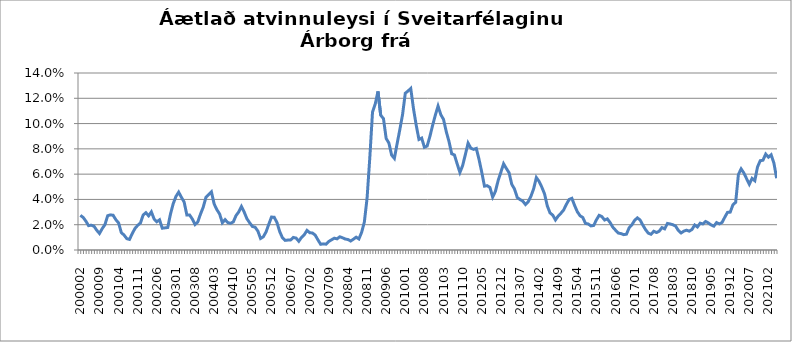
| Category | Series 0 |
|---|---|
| 200002 | 0.027 |
| 200003 | 0.026 |
| 200004 | 0.023 |
| 200005 | 0.019 |
| 200006 | 0.02 |
| 200007 | 0.019 |
| 200008 | 0.016 |
| 200009 | 0.013 |
| 200010 | 0.017 |
| 200011 | 0.02 |
| 200012 | 0.027 |
| 200101 | 0.028 |
| 200102 | 0.027 |
| 200103 | 0.024 |
| 200104 | 0.021 |
| 200105 | 0.014 |
| 200106 | 0.012 |
| 200107 | 0.009 |
| 200108 | 0.008 |
| 200109 | 0.013 |
| 200110 | 0.017 |
| 200111 | 0.02 |
| 200112 | 0.021 |
| 200201 | 0.028 |
| 200202 | 0.03 |
| 200203 | 0.027 |
| 200204 | 0.03 |
| 200205 | 0.025 |
| 200206 | 0.022 |
| 200207 | 0.024 |
| 200208 | 0.017 |
| 200209 | 0.018 |
| 200210 | 0.018 |
| 200211 | 0.028 |
| 200212 | 0.037 |
| 200301 | 0.042 |
| 200302 | 0.046 |
| 200303 | 0.042 |
| 200304 | 0.038 |
| 200305 | 0.028 |
| 200306 | 0.028 |
| 200307 | 0.025 |
| 200308 | 0.02 |
| 200309 | 0.022 |
| 200310 | 0.028 |
| 200311 | 0.034 |
| 200312 | 0.042 |
| 200401 | 0.044 |
| 200402 | 0.046 |
| 200403 | 0.036 |
| 200404 | 0.032 |
| 200405 | 0.029 |
| 200406 | 0.022 |
| 200407 | 0.024 |
| 200408 | 0.022 |
| 200409 | 0.021 |
| 200410 | 0.022 |
| 200411 | 0.027 |
| 200412 | 0.03 |
| 200501 | 0.034 |
| 200502 | 0.03 |
| 200503 | 0.025 |
| 200504 | 0.022 |
| 200505 | 0.019 |
| 200506 | 0.018 |
| 200507 | 0.015 |
| 200508 | 0.009 |
| 200509 | 0.01 |
| 200510 | 0.014 |
| 200511 | 0.02 |
| 200512 | 0.026 |
| 200601 | 0.026 |
| 200602 | 0.022 |
| 200603 | 0.015 |
| 200604 | 0.01 |
| 200605 | 0.008 |
| 200606 | 0.008 |
| 200607 | 0.008 |
| 200608 | 0.01 |
| 200609 | 0.009 |
| 200610 | 0.007 |
| 200611 | 0.01 |
| 200612 | 0.012 |
| 200701 | 0.015 |
| 200702 | 0.014 |
| 200703 | 0.013 |
| 200704 | 0.012 |
| 200705 | 0.008 |
| 200706 | 0.005 |
| 200707 | 0.005 |
| 200708 | 0.005 |
| 200709 | 0.007 |
| 200710 | 0.008 |
| 200711 | 0.009 |
| 200712 | 0.009 |
| 200801 | 0.01 |
| 200802 | 0.01 |
| 200803 | 0.009 |
| 200804 | 0.008 |
| 200805 | 0.007 |
| 200806 | 0.009 |
| 200807 | 0.01 |
| 200808 | 0.009 |
| 200809 | 0.014 |
| 200810 | 0.022 |
| 200811 | 0.041 |
| 200812 | 0.073 |
| 200901 | 0.109 |
| 200902 | 0.116 |
| 200903 | 0.125 |
| 200904 | 0.107 |
| 200905 | 0.104 |
| 200906 | 0.088 |
| 200907 | 0.085 |
| 200908 | 0.075 |
| 200909 | 0.072 |
| 200910 | 0.084 |
| 200911 | 0.095 |
| 200912 | 0.107 |
| 201001 | 0.124 |
| 201002 | 0.126 |
| 201003 | 0.128 |
| 201004 | 0.112 |
| 201005 | 0.099 |
| 201006 | 0.087 |
| 201007 | 0.089 |
| 201008 | 0.081 |
| 201009 | 0.082 |
| 201010 | 0.09 |
| 201011 | 0.099 |
| 201012 | 0.107 |
| 201101 | 0.114 |
| 201102 | 0.107 |
| 201103 | 0.103 |
| 201104 | 0.094 |
| 201105 | 0.086 |
| 201106 | 0.076 |
| 201107 | 0.075 |
| 201108 | 0.068 |
| 201109 | 0.061 |
| 201110 | 0.067 |
| 201111 | 0.076 |
| 201112 | 0.085 |
| 201201 | 0.081 |
| 201202 | 0.08 |
| 201203 | 0.08 |
| 201204 | 0.072 |
| 201205 | 0.062 |
| 201206 | 0.05 |
| 201207 | 0.051 |
| 201208 | 0.049 |
| 201209 | 0.042 |
| 201210 | 0.046 |
| 201211 | 0.055 |
| 201212 | 0.062 |
| 201301 | 0.068 |
| 201302 | 0.065 |
| 201303 | 0.061 |
| 201304 | 0.052 |
| 201305 | 0.048 |
| 201306 | 0.042 |
| 201307 | 0.04 |
| 201308 | 0.039 |
| 201309 | 0.036 |
| 201310 | 0.038 |
| 201311 | 0.042 |
| 201312 | 0.048 |
| 201401 | 0.057 |
| 201402 | 0.054 |
| 201403 | 0.05 |
| 201404 | 0.044 |
| 201405 | 0.035 |
| 201406 | 0.029 |
| 201407 | 0.028 |
| 201408 | 0.024 |
| 201409 | 0.027 |
| 201410 | 0.029 |
| 201411 | 0.032 |
| 201412 | 0.036 |
| 201501 | 0.04 |
| 201502 | 0.041 |
| 201503 | 0.035 |
| 201504 | 0.03 |
| 201505 | 0.027 |
| 201506 | 0.026 |
| 201507 | 0.021 |
| 201508 | 0.021 |
| 201509 | 0.019 |
| 201510 | 0.019 |
| 201511 | 0.024 |
| 201512 | 0.027 |
| 201601 | 0.026 |
| 201602 | 0.024 |
| 201603 | 0.025 |
| 201604 | 0.022 |
| 201605 | 0.018 |
| 201606 | 0.016 |
| 201607 | 0.013 |
| 201608 | 0.013 |
| 201609 | 0.012 |
| 201610 | 0.013 |
| 201611 | 0.018 |
| 201612 | 0.02 |
| 201701 | 0.024 |
| 201702 | 0.025 |
| 201703 | 0.024 |
| 201704 | 0.02 |
| 201705 | 0.016 |
| 201706 | 0.013 |
| 201707 | 0.012 |
| 201708 | 0.015 |
| 201709 | 0.014 |
| 201710 | 0.015 |
| 201711 | 0.018 |
| 201712 | 0.017 |
| 201801 | 0.021 |
| 201802 | 0.021 |
| 201803 | 0.02 |
| 201804 | 0.019 |
| 201805 | 0.015 |
| 201806 | 0.013 |
| 201807 | 0.015 |
| 201808 | 0.016 |
| 201809 | 0.015 |
| 201810 | 0.016 |
| 201811 | 0.02 |
| 201812 | 0.018 |
| 201901 | 0.021 |
| 201902 | 0.021 |
| 201903 | 0.023 |
| 201904 | 0.021 |
| 201905 | 0.02 |
| 201906 | 0.019 |
| 201907 | 0.022 |
| 201908 | 0.021 |
| 201909 | 0.022 |
| 201910 | 0.026 |
| 201911 | 0.03 |
| 201912 | 0.03 |
| 202001 | 0.036 |
| 202002 | 0.038 |
| 202003 | 0.06 |
| 202004 | 0.064 |
| 202005 | 0.061 |
| 202006 | 0.056 |
| 202007 | 0.052 |
| 202008 | 0.057 |
| 202009 | 0.055 |
| 202010 | 0.066 |
| 202011 | 0.071 |
| 202012 | 0.071 |
| 202101 | 0.076 |
| 202102 | 0.073 |
| 202103 | 0.075 |
| 202104 | 0.069 |
| 202105 | 0.057 |